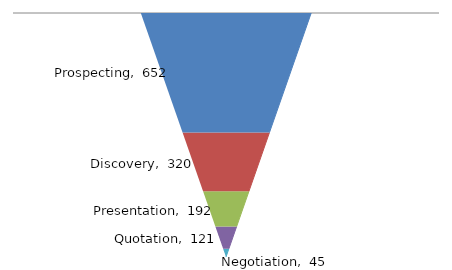
| Category | Prospecting | Discovery | Presentation | Quotation | Negotiation |
|---|---|---|---|---|---|
| # of Deals | 652 | 320 | 192 | 121 | 45 |